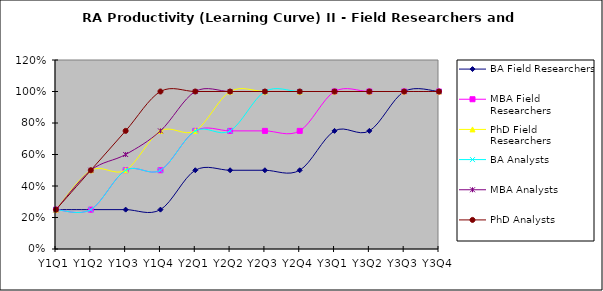
| Category | BA Field Researchers  | MBA Field Researchers  | PhD Field Researchers  | BA Analysts  | MBA Analysts  | PhD Analysts  |
|---|---|---|---|---|---|---|
| Y1Q1 | 0.25 | 0.25 | 0.25 | 0.25 | 0.25 | 0.25 |
| Y1Q2 | 0.25 | 0.25 | 0.5 | 0.25 | 0.5 | 0.5 |
| Y1Q3 | 0.25 | 0.5 | 0.5 | 0.5 | 0.6 | 0.75 |
| Y1Q4 | 0.25 | 0.5 | 0.75 | 0.5 | 0.75 | 1 |
| Y2Q1 | 0.5 | 0.75 | 0.75 | 0.75 | 1 | 1 |
| Y2Q2 | 0.5 | 0.75 | 1 | 0.75 | 1 | 1 |
| Y2Q3 | 0.5 | 0.75 | 1 | 1 | 1 | 1 |
| Y2Q4 | 0.5 | 0.75 | 1 | 1 | 1 | 1 |
| Y3Q1 | 0.75 | 1 | 1 | 1 | 1 | 1 |
| Y3Q2 | 0.75 | 1 | 1 | 1 | 1 | 1 |
| Y3Q3 | 1 | 1 | 1 | 1 | 1 | 1 |
| Y3Q4 | 1 | 1 | 1 | 1 | 1 | 1 |